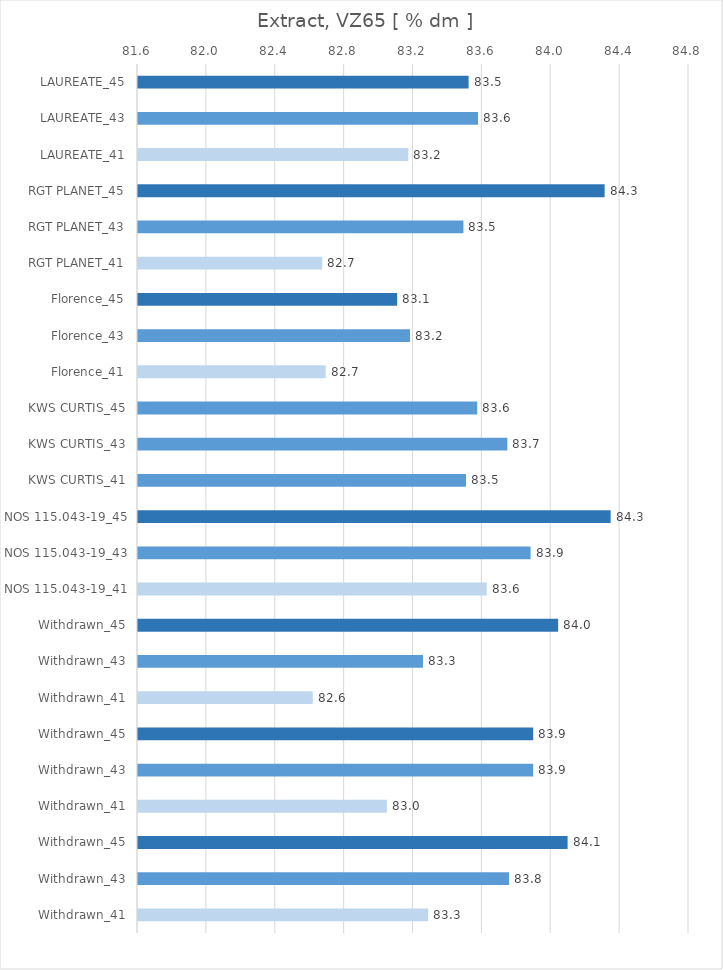
| Category |   Extract, VZ65 [ % dm ] |
|---|---|
| LAUREATE_45 | 83.52 |
| LAUREATE_43 | 83.575 |
| LAUREATE_41 | 83.17 |
| RGT PLANET_45 | 84.31 |
| RGT PLANET_43 | 83.49 |
| RGT PLANET_41 | 82.67 |
| Florence_45 | 83.105 |
| Florence_43 | 83.18 |
| Florence_41 | 82.69 |
| KWS CURTIS_45 | 83.57 |
| KWS CURTIS_43 | 83.745 |
| KWS CURTIS_41 | 83.505 |
| NOS 115.043-19_45 | 84.345 |
| NOS 115.043-19_43 | 83.88 |
| NOS 115.043-19_41 | 83.625 |
| Withdrawn_45 | 84.04 |
| Withdrawn_43 | 83.255 |
| Withdrawn_41 | 82.615 |
| Withdrawn_45 | 83.895 |
| Withdrawn_43 | 83.895 |
| Withdrawn_41 | 83.045 |
| Withdrawn_45 | 84.095 |
| Withdrawn_43 | 83.755 |
| Withdrawn_41 | 83.285 |